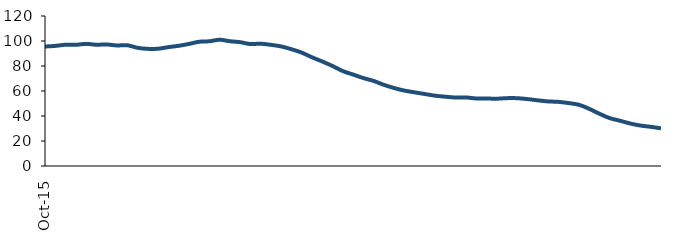
| Category | Series 0 |
|---|---|
| 2015-10-01 | 95.605 |
| 2015-11-01 | 96.083 |
| 2015-12-01 | 97.021 |
| 2016-01-01 | 96.946 |
| 2016-02-01 | 97.709 |
| 2016-03-01 | 97.008 |
| 2016-04-01 | 97.233 |
| 2016-05-01 | 96.435 |
| 2016-06-01 | 96.624 |
| 2016-07-01 | 94.579 |
| 2016-08-01 | 93.712 |
| 2016-09-01 | 93.809 |
| 2016-10-01 | 95.08 |
| 2016-11-01 | 96.15 |
| 2016-12-01 | 97.606 |
| 2017-01-01 | 99.382 |
| 2017-02-01 | 99.775 |
| 2017-03-01 | 101.011 |
| 2017-04-01 | 99.808 |
| 2017-05-01 | 99.071 |
| 2017-06-01 | 97.564 |
| 2017-07-01 | 97.854 |
| 2017-08-01 | 96.947 |
| 2017-09-01 | 95.667 |
| 2017-10-01 | 93.423 |
| 2017-11-01 | 90.719 |
| 2017-12-01 | 86.968 |
| 2018-01-01 | 83.64 |
| 2018-02-01 | 80.036 |
| 2018-03-01 | 75.964 |
| 2018-04-01 | 73.187 |
| 2018-05-01 | 70.36 |
| 2018-06-01 | 68.078 |
| 2018-07-01 | 64.939 |
| 2018-08-01 | 62.389 |
| 2018-09-01 | 60.336 |
| 2018-10-01 | 58.933 |
| 2018-11-01 | 57.563 |
| 2018-12-01 | 56.243 |
| 2019-01-01 | 55.421 |
| 2019-02-01 | 54.781 |
| 2019-03-01 | 54.837 |
| 2019-04-01 | 54.03 |
| 2019-05-01 | 53.984 |
| 2019-06-01 | 53.826 |
| 2019-07-01 | 54.287 |
| 2019-08-01 | 54.245 |
| 2019-09-01 | 53.526 |
| 2019-10-01 | 52.526 |
| 2019-11-01 | 51.664 |
| 2019-12-01 | 51.311 |
| 2020-01-01 | 50.348 |
| 2020-02-01 | 48.978 |
| 2020-03-01 | 45.766 |
| 2020-04-01 | 41.808 |
| 2020-05-01 | 38.31 |
| 2020-06-01 | 36.214 |
| 2020-07-01 | 33.993 |
| 2020-08-01 | 32.365 |
| 2020-09-01 | 31.338 |
| 2020-10-01 | 30.13 |